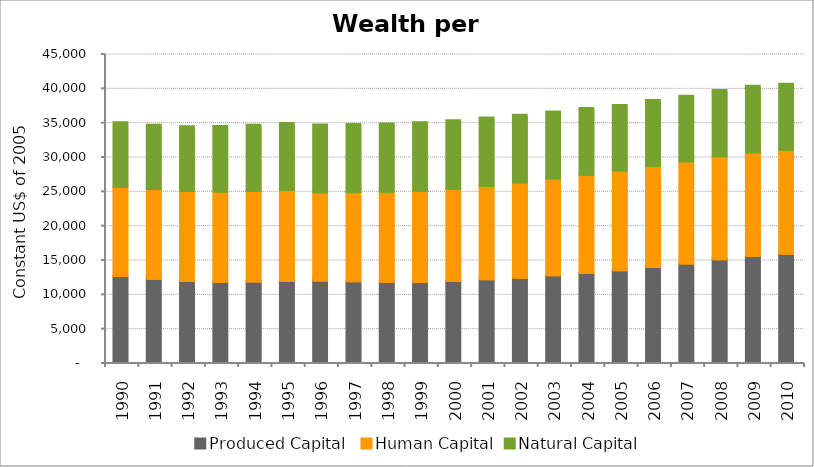
| Category | Produced Capital  | Human Capital | Natural Capital |
|---|---|---|---|
| 1990.0 | 12524.005 | 12986.9 | 9316.319 |
| 1991.0 | 12114.61 | 13062.577 | 9298 |
| 1992.0 | 11784.276 | 13114.171 | 9353.658 |
| 1993.0 | 11677.581 | 13146.349 | 9459.198 |
| 1994.0 | 11734.304 | 13177.576 | 9580.312 |
| 1995.0 | 11832.672 | 13201.184 | 9687.697 |
| 1996.0 | 11875.807 | 12849.666 | 9775.2 |
| 1997.0 | 11775.245 | 12978.369 | 9840.254 |
| 1998.0 | 11682.315 | 13098.86 | 9883.981 |
| 1999.0 | 11667.909 | 13257.667 | 9913.269 |
| 2000.0 | 11798.214 | 13447.411 | 9905.88 |
| 2001.0 | 12044.61 | 13627.251 | 9867.809 |
| 2002.0 | 12285.188 | 13839.486 | 9823.485 |
| 2003.0 | 12631.373 | 14076.857 | 9711.003 |
| 2004.0 | 12976.59 | 14309.115 | 9649.522 |
| 2005.0 | 13350.784 | 14526.913 | 9469.728 |
| 2006.0 | 13836.69 | 14714.91 | 9531.805 |
| 2007.0 | 14362.777 | 14864.517 | 9484.091 |
| 2008.0 | 14974.521 | 14974.209 | 9606.48 |
| 2009.0 | 15482.323 | 15056.252 | 9620.978 |
| 2010.0 | 15762.11 | 15123.614 | 9576.189 |